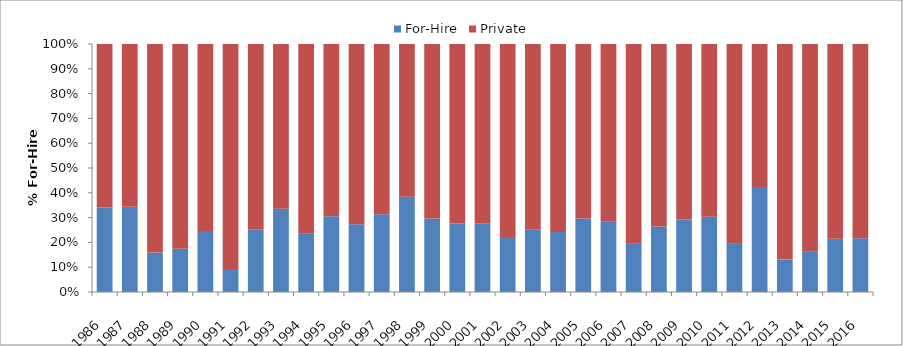
| Category | For-Hire | Private |
|---|---|---|
| 1986.0 | 0.341 | 0.659 |
| 1987.0 | 0.343 | 0.657 |
| 1988.0 | 0.159 | 0.841 |
| 1989.0 | 0.174 | 0.826 |
| 1990.0 | 0.246 | 0.754 |
| 1991.0 | 0.093 | 0.907 |
| 1992.0 | 0.253 | 0.747 |
| 1993.0 | 0.335 | 0.665 |
| 1994.0 | 0.235 | 0.765 |
| 1995.0 | 0.305 | 0.695 |
| 1996.0 | 0.273 | 0.727 |
| 1997.0 | 0.313 | 0.687 |
| 1998.0 | 0.384 | 0.616 |
| 1999.0 | 0.297 | 0.703 |
| 2000.0 | 0.276 | 0.724 |
| 2001.0 | 0.277 | 0.723 |
| 2002.0 | 0.222 | 0.778 |
| 2003.0 | 0.251 | 0.749 |
| 2004.0 | 0.242 | 0.758 |
| 2005.0 | 0.296 | 0.704 |
| 2006.0 | 0.283 | 0.717 |
| 2007.0 | 0.195 | 0.805 |
| 2008.0 | 0.265 | 0.735 |
| 2009.0 | 0.293 | 0.707 |
| 2010.0 | 0.303 | 0.697 |
| 2011.0 | 0.197 | 0.803 |
| 2012.0 | 0.423 | 0.577 |
| 2013.0 | 0.131 | 0.869 |
| 2014.0 | 0.163 | 0.837 |
| 2015.0 | 0.215 | 0.785 |
| 2016.0 | 0.217 | 0.783 |